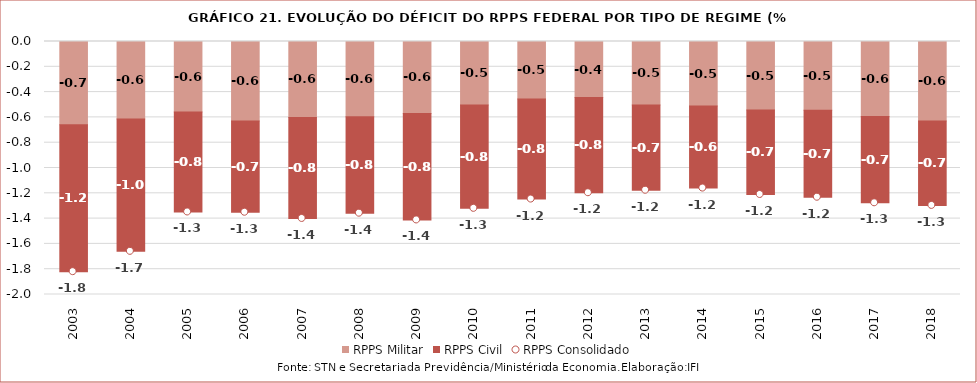
| Category | RPPS Militar | RPPS Civil |
|---|---|---|
| 2003.0 | -0.659 | -1.161 |
| 2004.0 | -0.613 | -1.046 |
| 2005.0 | -0.557 | -0.791 |
| 2006.0 | -0.629 | -0.72 |
| 2007.0 | -0.6 | -0.799 |
| 2008.0 | -0.595 | -0.763 |
| 2009.0 | -0.569 | -0.842 |
| 2010.0 | -0.503 | -0.816 |
| 2011.0 | -0.455 | -0.79 |
| 2012.0 | -0.443 | -0.753 |
| 2013.0 | -0.501 | -0.675 |
| 2014.0 | -0.511 | -0.648 |
| 2015.0 | -0.542 | -0.667 |
| 2016.0 | -0.544 | -0.687 |
| 2017.0 | -0.592 | -0.683 |
| 2018.0 | -0.629 | -0.667 |